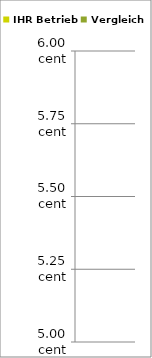
| Category | IHR Betrieb | Vergleich |
|---|---|---|
| 0 | 0 | 0 |